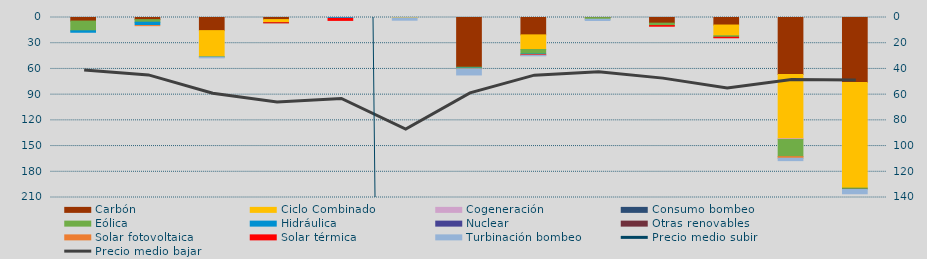
| Category | Carbón | Ciclo Combinado | Cogeneración | Consumo bombeo | Eólica | Hidráulica | Nuclear | Otras renovables | Solar fotovoltaica | Solar térmica | Turbinación bombeo |
|---|---|---|---|---|---|---|---|---|---|---|---|
| 0 | 4145.2 | 0 | 0 |  | 11379.4 | 2865.3 |  | 0 | 0 | 0 | 0 |
| 1 | 2530 | 0 | 0 |  | 2970.9 | 3920 |  | 0 | 95.9 | 0 | 0 |
| 2 | 15307.2 | 30295.6 | 0 |  | 607.6 | 24 |  | 0 | 0 | 0 | 856 |
| 3 | 2438 | 3386 | 0 |  | 274 | 0 |  | 0 | 0 | 117.8 | 0 |
| 4 | 0 | 0 | 0 |  | 0 | 1009.1 |  | 0 | 0 | 2368.1 | 0 |
| 5 | 0 | 400 | 0 |  | 0 | 0 |  | 0 | 0 | 0 | 2763.2 |
| 6 | 58033.7 | 0 | 0 |  | 988.1 | 1026.5 |  | 0 | 57.8 | 0 | 6933.6 |
| 7 | 20255.7 | 17094 | 0 |  | 5344.3 | 623 |  | 0 | 0 | 617.6 | 755.1 |
| 8 | 158.4 | 0 | 0 |  | 1844.3 | 12 |  | 0 | 0 | 0 | 1460 |
| 9 | 6575 | 0 | 0 |  | 2859 | 0 |  | 0 | 0 | 725.3 | 0 |
| 10 | 8771 | 12552 | 0 |  | 1652.9 | 70 |  | 0 | 0 | 608.7 | 0 |
| 11 | 66423 | 75034.9 | 910.1 |  | 19943.3 | 36 |  | 0 | 1820.4 | 0 | 2822.9 |
| 12 | 75870.4 | 123130.8 | 0 |  | 1278.3 | 0 |  | 288.4 | 0 | 0 | 5090.1 |